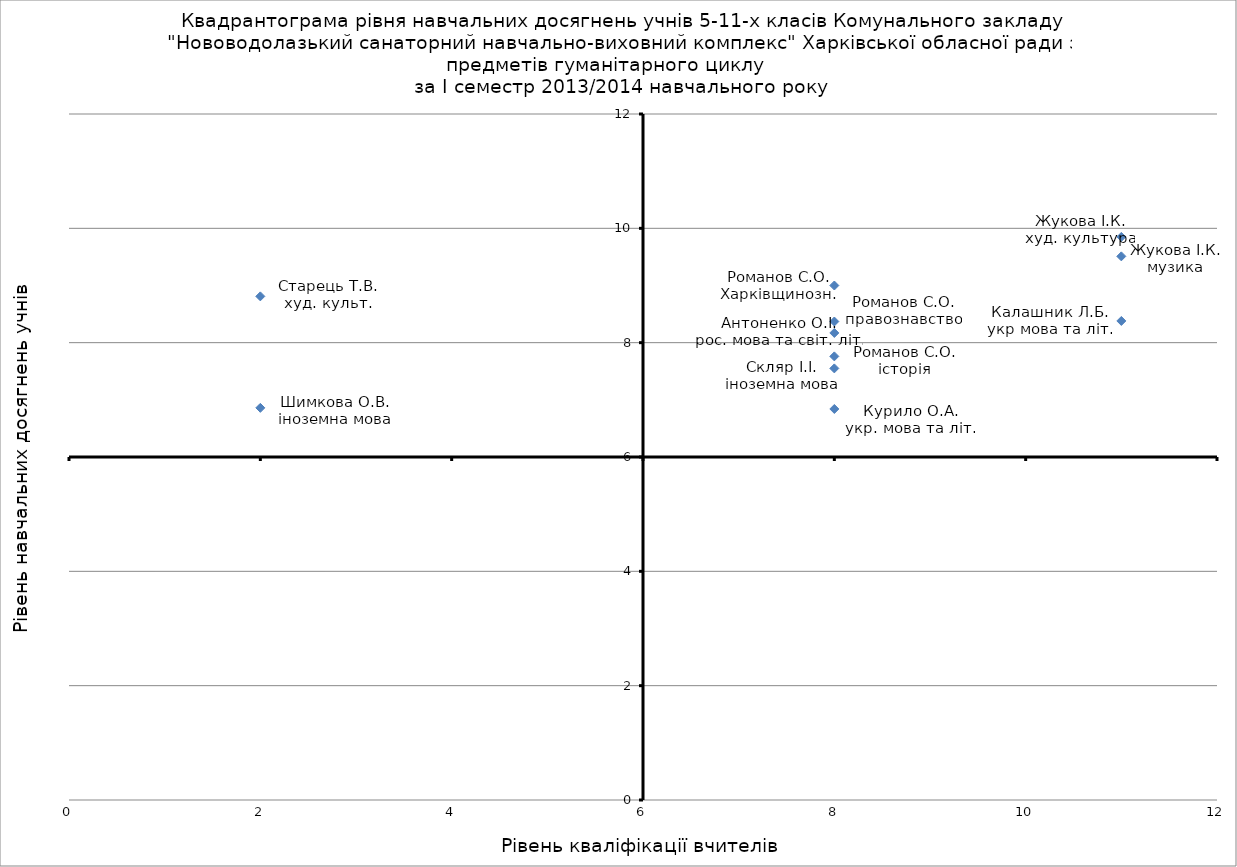
| Category | Series 0 |
|---|---|
| 11.0 | 8.38 |
| 8.0 | 6.84 |
| 8.0 | 7.55 |
| 8.0 | 7.76 |
| 11.0 | 9.51 |
| 2.0 | 6.86 |
| 8.0 | 8.17 |
| 8.0 | 8.37 |
| 8.0 | 9 |
| 2.0 | 8.81 |
| 11.0 | 9.85 |